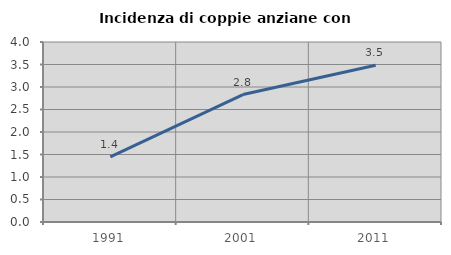
| Category | Incidenza di coppie anziane con figli |
|---|---|
| 1991.0 | 1.449 |
| 2001.0 | 2.832 |
| 2011.0 | 3.482 |